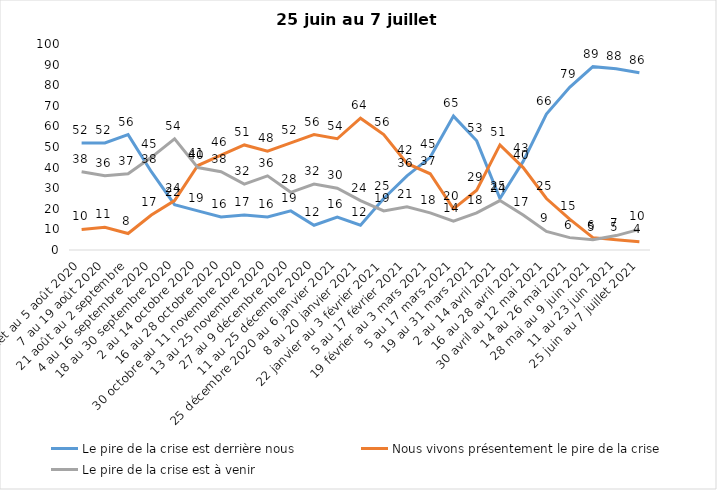
| Category | Le pire de la crise est derrière nous | Nous vivons présentement le pire de la crise | Le pire de la crise est à venir |
|---|---|---|---|
| 24 juillet au 5 août 2020 | 52 | 10 | 38 |
| 7 au 19 août 2020 | 52 | 11 | 36 |
| 21 août au 2 septembre | 56 | 8 | 37 |
| 4 au 16 septembre 2020 | 38 | 17 | 45 |
| 18 au 30 septembre 2020 | 22 | 24 | 54 |
| 2 au 14 octobre 2020 | 19 | 41 | 40 |
| 16 au 28 octobre 2020 | 16 | 46 | 38 |
| 30 octobre au 11 novembre 2020 | 17 | 51 | 32 |
| 13 au 25 novembre 2020 | 16 | 48 | 36 |
| 27 au 9 décembre 2020 | 19 | 52 | 28 |
| 11 au 25 décembre 2020 | 12 | 56 | 32 |
| 25 décembre 2020 au 6 janvier 2021 | 16 | 54 | 30 |
| 8 au 20 janvier 2021 | 12 | 64 | 24 |
| 22 janvier au 3 février 2021 | 25 | 56 | 19 |
| 5 au 17 février 2021 | 36 | 42 | 21 |
| 19 février au 3 mars 2021 | 45 | 37 | 18 |
| 5 au 17 mars 2021 | 65 | 20 | 14 |
| 19 au 31 mars 2021 | 53 | 29 | 18 |
| 2 au 14 avril 2021 | 25 | 51 | 24 |
| 16 au 28 avril 2021 | 43 | 40 | 17 |
| 30 avril au 12 mai 2021 | 66 | 25 | 9 |
| 14 au 26 mai 2021 | 79 | 15 | 6 |
| 28 mai au 9 juin 2021 | 89 | 6 | 5 |
| 11 au 23 juin 2021 | 88 | 5 | 7 |
| 25 juin au 7 juillet 2021 | 86 | 4 | 10 |